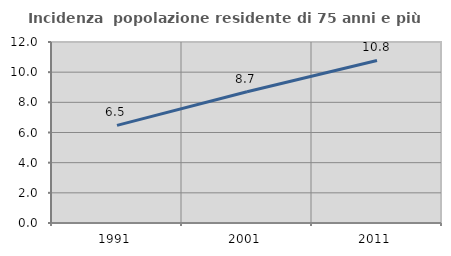
| Category | Incidenza  popolazione residente di 75 anni e più |
|---|---|
| 1991.0 | 6.47 |
| 2001.0 | 8.703 |
| 2011.0 | 10.776 |